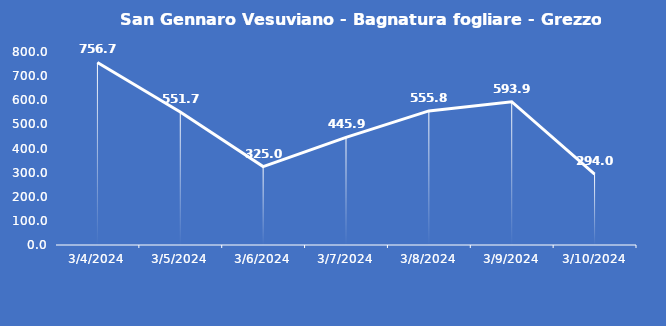
| Category | San Gennaro Vesuviano - Bagnatura fogliare - Grezzo (min) |
|---|---|
| 3/4/24 | 756.7 |
| 3/5/24 | 551.7 |
| 3/6/24 | 325 |
| 3/7/24 | 445.9 |
| 3/8/24 | 555.8 |
| 3/9/24 | 593.9 |
| 3/10/24 | 294 |